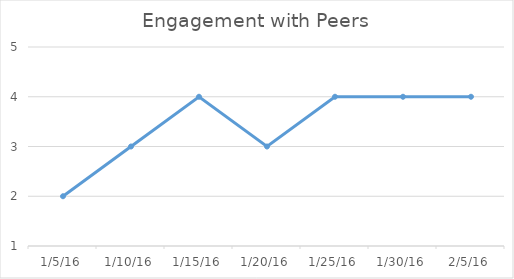
| Category | Series 0 |
|---|---|
| 1/5/16 | 2 |
| 1/10/16 | 3 |
| 1/15/16 | 4 |
| 1/20/16 | 3 |
| 1/25/16 | 4 |
| 1/30/16 | 4 |
| 2/5/16 | 4 |